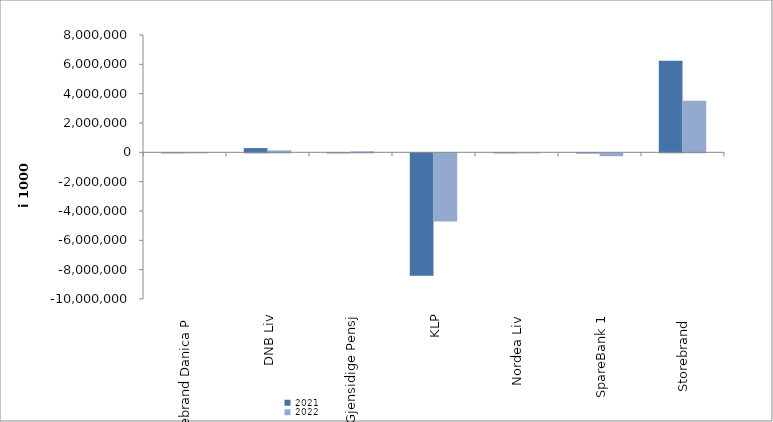
| Category | 2021 | 2022 |
|---|---|---|
| Storebrand Danica P | 829.952 | 4710.645 |
| DNB Liv | 288795.456 | 130297 |
| Gjensidige Pensj | -2938.4 | 64683 |
| KLP | -8346122.359 | -4649242.229 |
| Nordea Liv | 688.2 | -2551.892 |
| SpareBank 1 | -9015.001 | -194276.143 |
| Storebrand  | 6247965.136 | 3516428.957 |